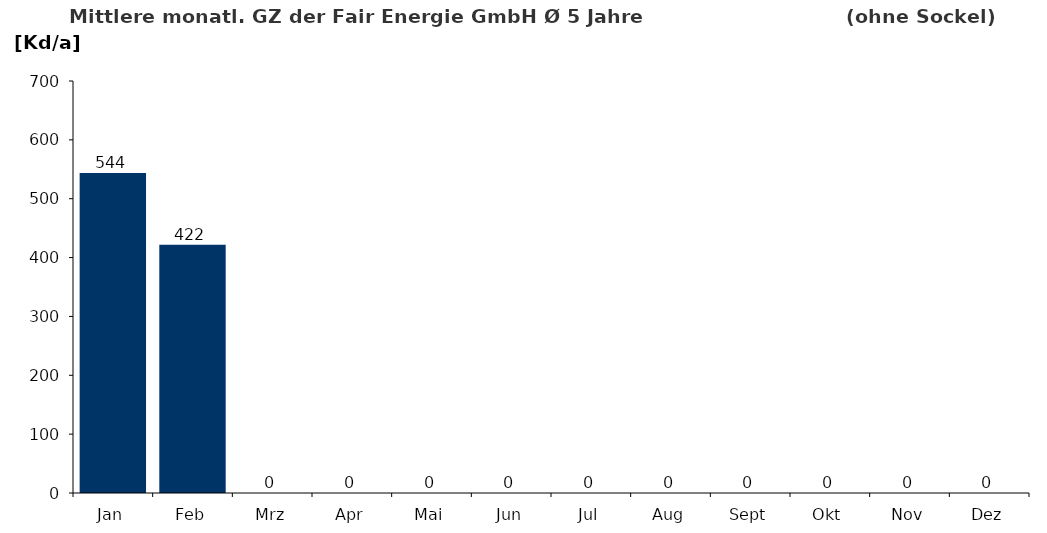
| Category | Gradtagszahl |
|---|---|
| Jan | 543.68 |
| Feb | 421.82 |
| Mrz | 0 |
| Apr | 0 |
| Mai | 0 |
| Jun | 0 |
| Jul | 0 |
| Aug | 0 |
| Sept | 0 |
| Okt | 0 |
| Nov | 0 |
| Dez | 0 |